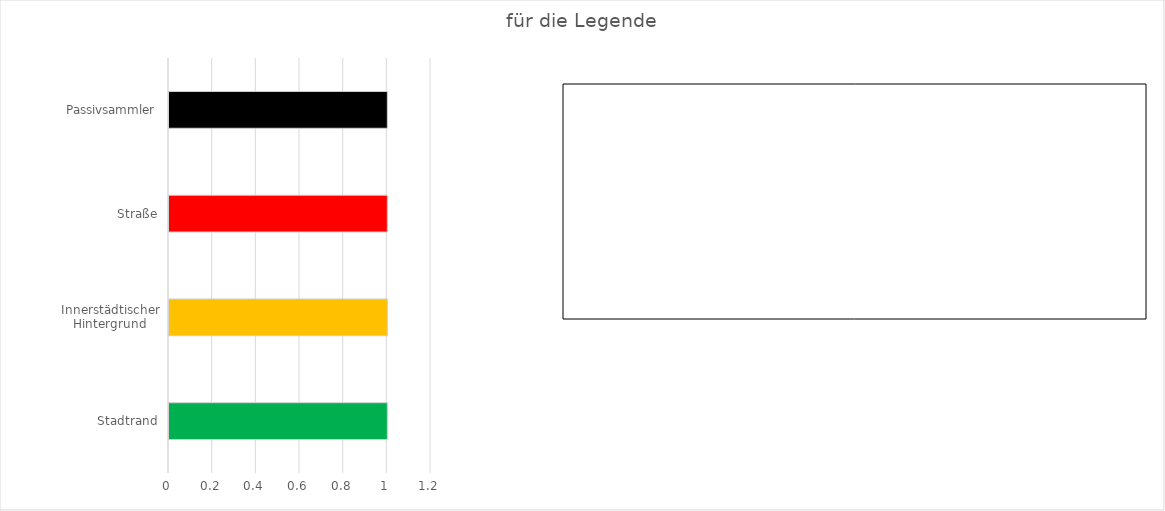
| Category | Series 0 |
|---|---|
| Stadtrand | 1 |
| Innerstädtischer Hintergrund | 1 |
| Straße | 1 |
| Passivsammler | 1 |